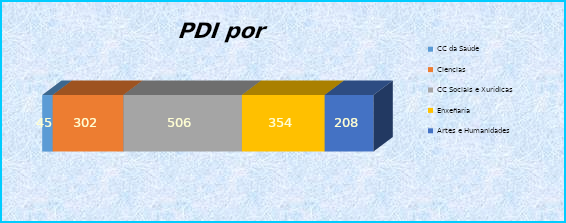
| Category | CC da Saúde | Ciencias | CC Sociais e Xurídicas | Enxeñaría | Artes e Humanidades |
|---|---|---|---|---|---|
| 0 | 45 | 302 | 506 | 354 | 208 |